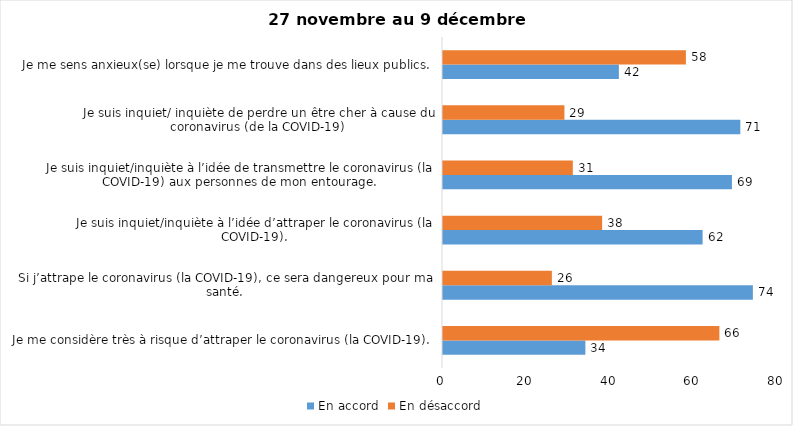
| Category | En accord | En désaccord |
|---|---|---|
| Je me considère très à risque d’attraper le coronavirus (la COVID-19). | 34 | 66 |
| Si j’attrape le coronavirus (la COVID-19), ce sera dangereux pour ma santé. | 74 | 26 |
| Je suis inquiet/inquiète à l’idée d’attraper le coronavirus (la COVID-19). | 62 | 38 |
| Je suis inquiet/inquiète à l’idée de transmettre le coronavirus (la COVID-19) aux personnes de mon entourage. | 69 | 31 |
| Je suis inquiet/ inquiète de perdre un être cher à cause du coronavirus (de la COVID-19) | 71 | 29 |
| Je me sens anxieux(se) lorsque je me trouve dans des lieux publics. | 42 | 58 |